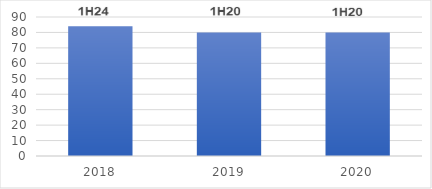
| Category | Series 0 |
|---|---|
| 2018.0 | 84 |
| 2019.0 | 80 |
| 2020.0 | 80 |